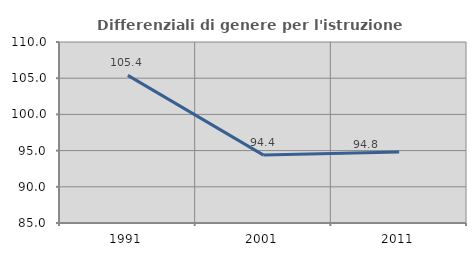
| Category | Differenziali di genere per l'istruzione superiore |
|---|---|
| 1991.0 | 105.385 |
| 2001.0 | 94.376 |
| 2011.0 | 94.821 |